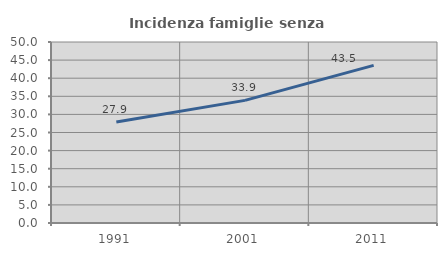
| Category | Incidenza famiglie senza nuclei |
|---|---|
| 1991.0 | 27.907 |
| 2001.0 | 33.878 |
| 2011.0 | 43.53 |